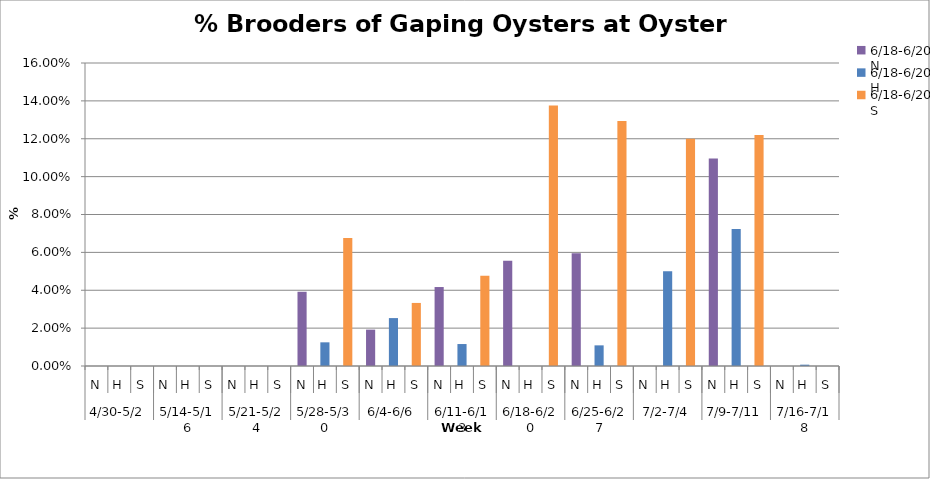
| Category | % Brooders |
|---|---|
| 0 | 0 |
| 1 | 0 |
| 2 | 0 |
| 3 | 0 |
| 4 | 0 |
| 5 | 0 |
| 6 | 0 |
| 7 | 0 |
| 8 | 0 |
| 9 | 0.039 |
| 10 | 0.012 |
| 11 | 0.068 |
| 12 | 0.019 |
| 13 | 0.025 |
| 14 | 0.033 |
| 15 | 0.042 |
| 16 | 0.012 |
| 17 | 0.048 |
| 18 | 0.056 |
| 19 | 0 |
| 20 | 0.138 |
| 21 | 0.06 |
| 22 | 0.011 |
| 23 | 0.129 |
| 24 | 0 |
| 25 | 0.05 |
| 26 | 0.12 |
| 27 | 0.11 |
| 28 | 0.072 |
| 29 | 0.122 |
| 30 | 0 |
| 31 | 0.001 |
| 32 | 0 |